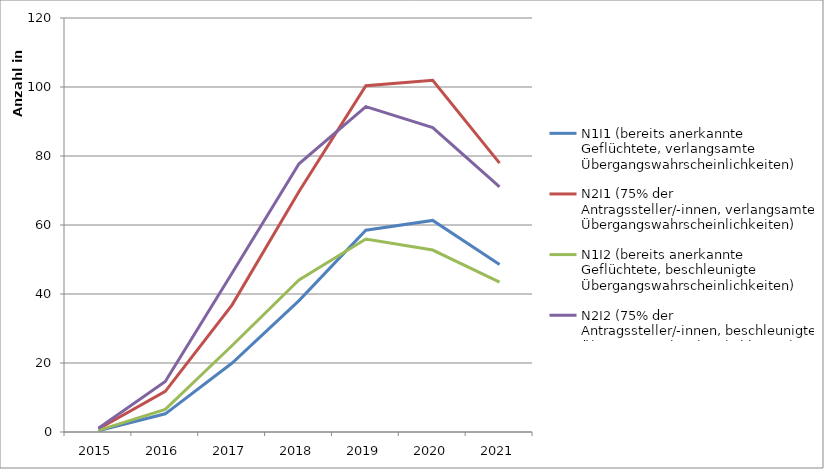
| Category | N1I1 (bereits anerkannte Geflüchtete, verlangsamte Übergangswahrscheinlichkeiten) | N2I1 (75% der Antragssteller/-innen, verlangsamte Übergangswahrscheinlichkeiten) | N1I2 (bereits anerkannte Geflüchtete, beschleunigte Übergangswahrscheinlichkeiten) | N2I2 (75% der Antragssteller/-innen, beschleunigte Übergangswahrscheinlichkeiten) |
|---|---|---|---|---|
| 2015.0 | 368 | 887 | 458 | 1103 |
| 2016.0 | 5268 | 11775 | 6565 | 14646 |
| 2017.0 | 19999 | 36865 | 25077 | 46093 |
| 2018.0 | 38098 | 69731 | 44074 | 77731 |
| 2019.0 | 58498 | 100368 | 55927 | 94301 |
| 2020.0 | 61328 | 101920 | 52742 | 88205 |
| 2021.0 | 48521 | 77933 | 43415 | 71067 |